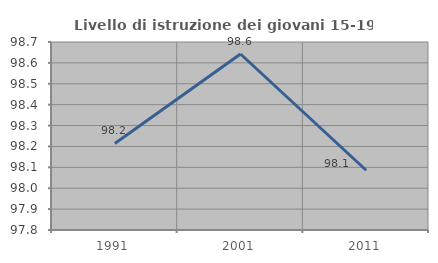
| Category | Livello di istruzione dei giovani 15-19 anni |
|---|---|
| 1991.0 | 98.214 |
| 2001.0 | 98.643 |
| 2011.0 | 98.086 |